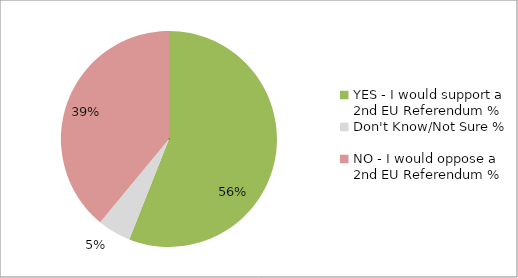
| Category | Share |
|---|---|
| YES - I would support a 2nd EU Referendum % | 0.56 |
| Don't Know/Not Sure % | 0.05 |
| NO - I would oppose a 2nd EU Referendum % | 0.39 |